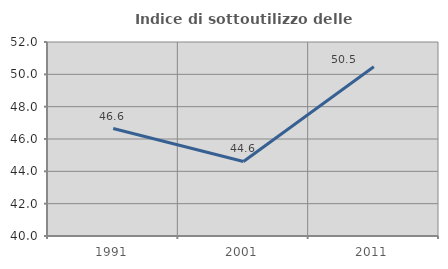
| Category | Indice di sottoutilizzo delle abitazioni  |
|---|---|
| 1991.0 | 46.647 |
| 2001.0 | 44.611 |
| 2011.0 | 50.467 |